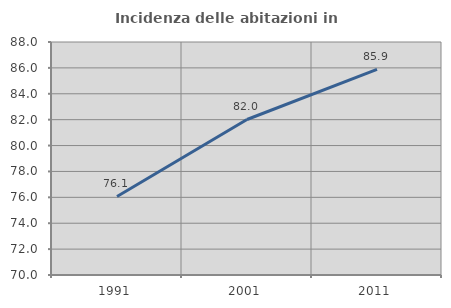
| Category | Incidenza delle abitazioni in proprietà  |
|---|---|
| 1991.0 | 76.068 |
| 2001.0 | 82.014 |
| 2011.0 | 85.881 |